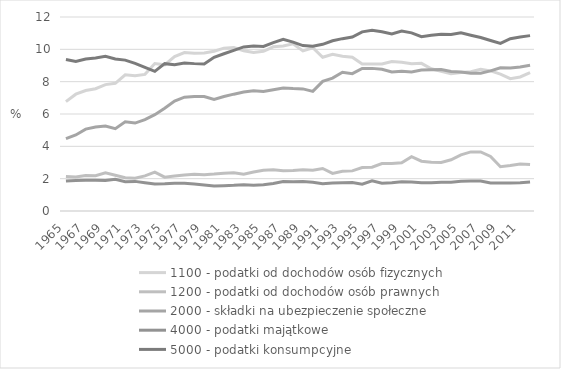
| Category | 1100 - podatki od dochodów osób fizycznych | 1200 - podatki od dochodów osób prawnych | 2000 - składki na ubezpieczenie społeczne | 4000 - podatki majątkowe | 5000 - podatki konsumpcyjne |
|---|---|---|---|---|---|
| 1965 | 6.763 | 2.133 | 4.475 | 1.852 | 9.368 |
| 1966 | 7.225 | 2.098 | 4.703 | 1.885 | 9.249 |
| 1967 | 7.452 | 2.198 | 5.063 | 1.906 | 9.405 |
| 1968 | 7.562 | 2.179 | 5.201 | 1.901 | 9.469 |
| 1969 | 7.817 | 2.356 | 5.26 | 1.887 | 9.573 |
| 1970 | 7.896 | 2.209 | 5.096 | 1.958 | 9.407 |
| 1971 | 8.427 | 2.056 | 5.517 | 1.817 | 9.333 |
| 1972 | 8.363 | 2.024 | 5.44 | 1.832 | 9.137 |
| 1973 | 8.452 | 2.174 | 5.654 | 1.751 | 8.883 |
| 1974 | 9.124 | 2.403 | 5.958 | 1.673 | 8.637 |
| 1975 | 9.043 | 2.094 | 6.36 | 1.685 | 9.113 |
| 1976 | 9.548 | 2.162 | 6.797 | 1.712 | 9.049 |
| 1977 | 9.798 | 2.231 | 7.043 | 1.722 | 9.148 |
| 1978 | 9.757 | 2.274 | 7.08 | 1.672 | 9.116 |
| 1979 | 9.77 | 2.246 | 7.086 | 1.606 | 9.098 |
| 1980 | 9.88 | 2.283 | 6.899 | 1.54 | 9.507 |
| 1981 | 10.075 | 2.334 | 7.08 | 1.567 | 9.725 |
| 1982 | 10.105 | 2.363 | 7.227 | 1.587 | 9.939 |
| 1983 | 9.915 | 2.271 | 7.357 | 1.63 | 10.148 |
| 1984 | 9.811 | 2.411 | 7.44 | 1.597 | 10.21 |
| 1985 | 9.877 | 2.526 | 7.391 | 1.618 | 10.183 |
| 1986 | 10.156 | 2.544 | 7.5 | 1.696 | 10.41 |
| 1987 | 10.213 | 2.492 | 7.612 | 1.826 | 10.625 |
| 1988 | 10.343 | 2.506 | 7.572 | 1.809 | 10.443 |
| 1989 | 9.903 | 2.556 | 7.553 | 1.831 | 10.233 |
| 1990 | 10.101 | 2.516 | 7.402 | 1.774 | 10.189 |
| 1991 | 9.508 | 2.632 | 8.021 | 1.681 | 10.312 |
| 1992 | 9.692 | 2.326 | 8.217 | 1.725 | 10.528 |
| 1993 | 9.569 | 2.454 | 8.582 | 1.745 | 10.661 |
| 1994 | 9.511 | 2.482 | 8.497 | 1.768 | 10.764 |
| 1995 | 9.091 | 2.686 | 8.821 | 1.653 | 11.082 |
| 1996 | 9.095 | 2.712 | 8.822 | 1.866 | 11.177 |
| 1997 | 9.095 | 2.931 | 8.765 | 1.719 | 11.09 |
| 1998 | 9.247 | 2.933 | 8.602 | 1.744 | 10.957 |
| 1999 | 9.207 | 2.985 | 8.638 | 1.808 | 11.125 |
| 2000 | 9.109 | 3.357 | 8.605 | 1.8 | 11.017 |
| 2001 | 9.133 | 3.079 | 8.718 | 1.754 | 10.782 |
| 2002 | 8.795 | 3.017 | 8.738 | 1.751 | 10.867 |
| 2003 | 8.643 | 3.007 | 8.754 | 1.775 | 10.937 |
| 2004 | 8.484 | 3.166 | 8.631 | 1.778 | 10.92 |
| 2005 | 8.561 | 3.472 | 8.6 | 1.833 | 11.019 |
| 2006 | 8.616 | 3.655 | 8.516 | 1.863 | 10.875 |
| 2007 | 8.762 | 3.656 | 8.522 | 1.855 | 10.734 |
| 2008 | 8.669 | 3.374 | 8.667 | 1.739 | 10.547 |
| 2009 | 8.465 | 2.739 | 8.857 | 1.727 | 10.371 |
| 2010 | 8.186 | 2.808 | 8.85 | 1.726 | 10.661 |
| 2011 | 8.29 | 2.909 | 8.905 | 1.746 | 10.767 |
| 2012 | 8.555 | 2.876 | 9.015 | 1.787 | 10.848 |